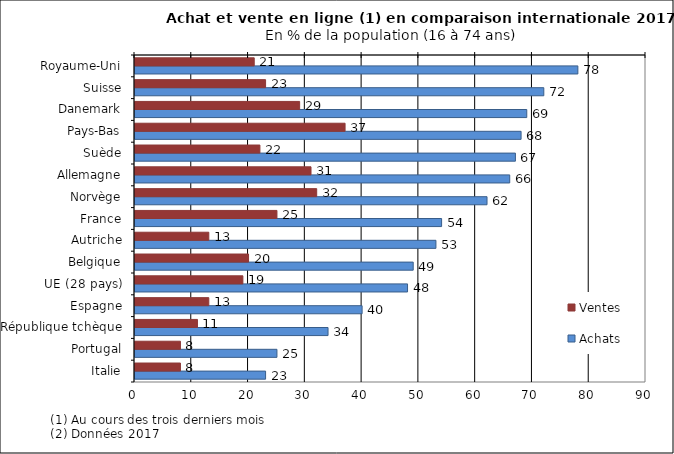
| Category | Achats | Ventes |
|---|---|---|
| Italie | 23 | 8 |
| Portugal | 25 | 8 |
| République tchèque | 34 | 11 |
| Espagne | 40 | 13 |
| UE (28 pays) | 48 | 19 |
| Belgique | 49 | 20 |
| Autriche | 53 | 13 |
| France | 54 | 25 |
| Norvège | 62 | 32 |
| Allemagne | 66 | 31 |
| Suède | 67 | 22 |
| Pays-Bas | 68 | 37 |
| Danemark | 69 | 29 |
| Suisse | 72 | 23 |
| Royaume-Uni | 78 | 21 |